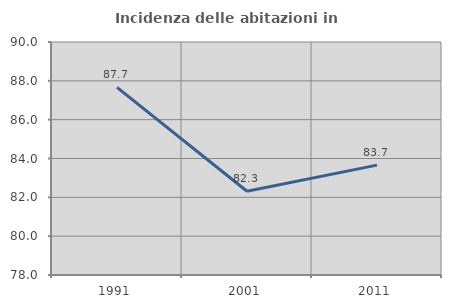
| Category | Incidenza delle abitazioni in proprietà  |
|---|---|
| 1991.0 | 87.661 |
| 2001.0 | 82.315 |
| 2011.0 | 83.66 |